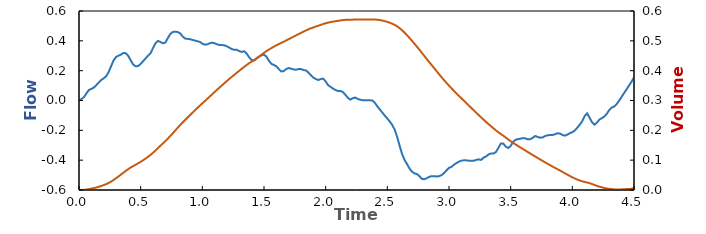
| Category | V' |
|---|---|
| 0.0 | 0 |
| 0.02 | 0.01 |
| 0.04 | 0.022 |
| 0.06 | 0.048 |
| 0.08 | 0.07 |
| 0.1 | 0.077 |
| 0.12 | 0.087 |
| 0.14 | 0.103 |
| 0.16 | 0.121 |
| 0.18 | 0.137 |
| 0.2 | 0.149 |
| 0.22 | 0.163 |
| 0.24 | 0.19 |
| 0.26 | 0.229 |
| 0.28 | 0.268 |
| 0.3 | 0.291 |
| 0.32 | 0.301 |
| 0.34 | 0.308 |
| 0.36 | 0.319 |
| 0.38 | 0.317 |
| 0.4 | 0.298 |
| 0.42 | 0.268 |
| 0.44 | 0.241 |
| 0.46 | 0.229 |
| 0.48 | 0.232 |
| 0.5 | 0.245 |
| 0.52 | 0.264 |
| 0.54 | 0.282 |
| 0.56 | 0.301 |
| 0.58 | 0.317 |
| 0.6 | 0.351 |
| 0.62 | 0.383 |
| 0.64 | 0.4 |
| 0.66 | 0.393 |
| 0.68 | 0.383 |
| 0.7 | 0.388 |
| 0.72 | 0.418 |
| 0.74 | 0.446 |
| 0.76 | 0.459 |
| 0.78 | 0.462 |
| 0.8 | 0.459 |
| 0.82 | 0.45 |
| 0.84 | 0.429 |
| 0.86 | 0.416 |
| 0.88 | 0.413 |
| 0.9 | 0.411 |
| 0.92 | 0.406 |
| 0.94 | 0.402 |
| 0.96 | 0.397 |
| 0.98 | 0.393 |
| 1.0 | 0.381 |
| 1.02 | 0.374 |
| 1.04 | 0.377 |
| 1.06 | 0.383 |
| 1.08 | 0.388 |
| 1.1 | 0.383 |
| 1.12 | 0.377 |
| 1.14 | 0.372 |
| 1.16 | 0.372 |
| 1.18 | 0.37 |
| 1.2 | 0.363 |
| 1.22 | 0.354 |
| 1.24 | 0.344 |
| 1.26 | 0.34 |
| 1.28 | 0.34 |
| 1.3 | 0.331 |
| 1.32 | 0.326 |
| 1.34 | 0.331 |
| 1.36 | 0.314 |
| 1.38 | 0.289 |
| 1.4 | 0.271 |
| 1.42 | 0.268 |
| 1.44 | 0.282 |
| 1.46 | 0.294 |
| 1.48 | 0.303 |
| 1.5 | 0.308 |
| 1.52 | 0.294 |
| 1.54 | 0.266 |
| 1.56 | 0.245 |
| 1.58 | 0.238 |
| 1.6 | 0.229 |
| 1.62 | 0.211 |
| 1.64 | 0.195 |
| 1.66 | 0.197 |
| 1.68 | 0.211 |
| 1.7 | 0.218 |
| 1.72 | 0.213 |
| 1.74 | 0.209 |
| 1.76 | 0.206 |
| 1.78 | 0.211 |
| 1.8 | 0.211 |
| 1.82 | 0.204 |
| 1.84 | 0.202 |
| 1.86 | 0.188 |
| 1.88 | 0.169 |
| 1.9 | 0.153 |
| 1.92 | 0.144 |
| 1.94 | 0.137 |
| 1.96 | 0.144 |
| 1.98 | 0.146 |
| 2.0 | 0.128 |
| 2.02 | 0.103 |
| 2.04 | 0.091 |
| 2.06 | 0.08 |
| 2.08 | 0.07 |
| 2.1 | 0.064 |
| 2.12 | 0.064 |
| 2.14 | 0.057 |
| 2.16 | 0.038 |
| 2.18 | 0.018 |
| 2.2 | 0.006 |
| 2.22 | 0.015 |
| 2.24 | 0.02 |
| 2.26 | 0.011 |
| 2.28 | 0.005 |
| 2.3 | 0.002 |
| 2.32 | 0.002 |
| 2.34 | 0.001 |
| 2.36 | 0.001 |
| 2.38 | 0 |
| 2.4 | -0.017 |
| 2.42 | -0.04 |
| 2.44 | -0.061 |
| 2.46 | -0.081 |
| 2.48 | -0.102 |
| 2.5 | -0.121 |
| 2.52 | -0.141 |
| 2.54 | -0.164 |
| 2.56 | -0.196 |
| 2.58 | -0.245 |
| 2.6 | -0.305 |
| 2.62 | -0.36 |
| 2.64 | -0.399 |
| 2.66 | -0.427 |
| 2.68 | -0.456 |
| 2.7 | -0.477 |
| 2.72 | -0.489 |
| 2.74 | -0.493 |
| 2.76 | -0.507 |
| 2.78 | -0.525 |
| 2.8 | -0.528 |
| 2.82 | -0.521 |
| 2.84 | -0.512 |
| 2.86 | -0.507 |
| 2.88 | -0.507 |
| 2.9 | -0.509 |
| 2.92 | -0.507 |
| 2.94 | -0.5 |
| 2.96 | -0.486 |
| 2.98 | -0.468 |
| 3.0 | -0.452 |
| 3.02 | -0.445 |
| 3.04 | -0.431 |
| 3.06 | -0.42 |
| 3.08 | -0.41 |
| 3.1 | -0.403 |
| 3.12 | -0.401 |
| 3.14 | -0.401 |
| 3.16 | -0.403 |
| 3.18 | -0.403 |
| 3.2 | -0.403 |
| 3.22 | -0.399 |
| 3.24 | -0.394 |
| 3.26 | -0.399 |
| 3.28 | -0.383 |
| 3.3 | -0.376 |
| 3.32 | -0.362 |
| 3.34 | -0.355 |
| 3.36 | -0.355 |
| 3.38 | -0.346 |
| 3.4 | -0.318 |
| 3.42 | -0.288 |
| 3.44 | -0.288 |
| 3.46 | -0.309 |
| 3.48 | -0.318 |
| 3.5 | -0.305 |
| 3.52 | -0.277 |
| 3.54 | -0.263 |
| 3.56 | -0.259 |
| 3.58 | -0.256 |
| 3.6 | -0.252 |
| 3.62 | -0.254 |
| 3.64 | -0.261 |
| 3.66 | -0.259 |
| 3.68 | -0.249 |
| 3.7 | -0.238 |
| 3.72 | -0.245 |
| 3.74 | -0.249 |
| 3.76 | -0.247 |
| 3.78 | -0.238 |
| 3.8 | -0.233 |
| 3.82 | -0.231 |
| 3.84 | -0.231 |
| 3.86 | -0.226 |
| 3.88 | -0.219 |
| 3.9 | -0.222 |
| 3.92 | -0.231 |
| 3.94 | -0.236 |
| 3.96 | -0.229 |
| 3.98 | -0.219 |
| 4.0 | -0.213 |
| 4.02 | -0.201 |
| 4.04 | -0.183 |
| 4.06 | -0.162 |
| 4.08 | -0.139 |
| 4.1 | -0.104 |
| 4.12 | -0.086 |
| 4.14 | -0.116 |
| 4.16 | -0.146 |
| 4.18 | -0.162 |
| 4.2 | -0.148 |
| 4.22 | -0.127 |
| 4.24 | -0.118 |
| 4.26 | -0.107 |
| 4.28 | -0.088 |
| 4.3 | -0.063 |
| 4.32 | -0.047 |
| 4.34 | -0.04 |
| 4.36 | -0.024 |
| 4.38 | 0 |
| 4.48 | 0.126 |
| 4.5 | 0.156 |
| 4.52 | 0.183 |
| 4.54 | 0.197 |
| 4.56 | 0.211 |
| 4.58 | 0.229 |
| 4.6 | 0.248 |
| 4.62 | 0.259 |
| 4.64 | 0.275 |
| 4.66 | 0.289 |
| 4.68 | 0.303 |